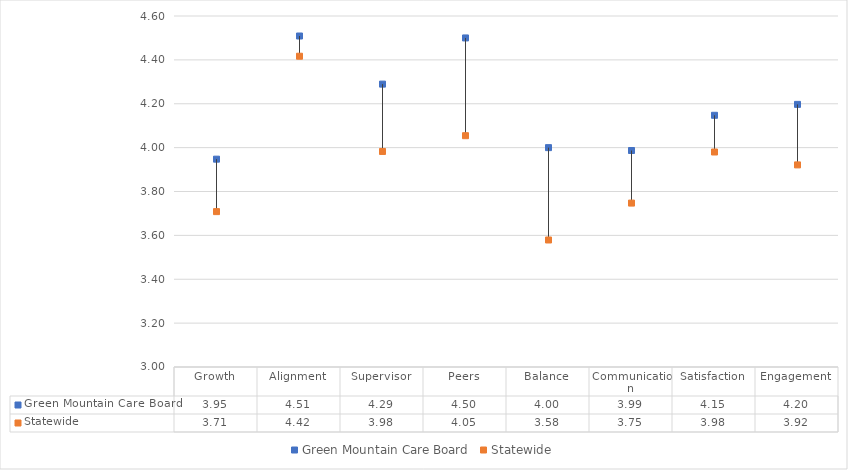
| Category | Green Mountain Care Board | Statewide |
|---|---|---|
| Growth | 3.947 | 3.708 |
| Alignment | 4.509 | 4.417 |
| Supervisor | 4.289 | 3.983 |
| Peers | 4.5 | 4.054 |
| Balance | 4 | 3.579 |
| Communication | 3.987 | 3.747 |
| Satisfaction | 4.147 | 3.98 |
| Engagement | 4.197 | 3.921 |